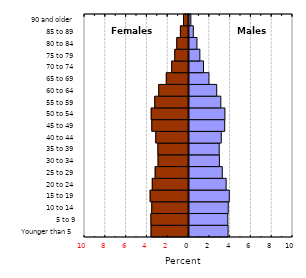
| Category | Male |
|---|---|
| Younger than 5 | 3.76 |
| 5 to 9 | 3.733 |
| 10 to 14 | 3.772 |
| 15 to 19 | 3.876 |
| 20 to 24 | 3.57 |
| 25 to 29 | 3.202 |
| 30 to 34 | 2.923 |
| 35 to 39 | 2.907 |
| 40 to 44 | 3.104 |
| 45 to 49 | 3.434 |
| 50 to 54 | 3.451 |
| 55 to 59 | 3.06 |
| 60 to 64 | 2.666 |
| 65 to 69 | 1.92 |
| 70 to 74 | 1.393 |
| 75 to 79 | 1.045 |
| 80 to 84 | 0.765 |
| 85 to 89 | 0.414 |
| 90 and older | 0.18 |